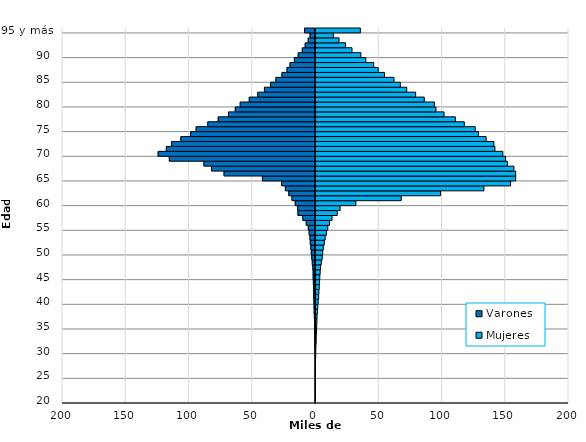
| Category | Varones | Mujeres |
|---|---|---|
| 20 | -145 | 117 |
| 21 | -134 | 126 |
| 22 | -133 | 121 |
| 23 | -152 | 178 |
| 24 | -229 | 221 |
| 25 | -256 | 236 |
| 26 | -257 | 311 |
| 27 | -258 | 339 |
| 28 | -273 | 433 |
| 29 | -349 | 555 |
| 30 | -364 | 589 |
| 31 | -412 | 704 |
| 32 | -460 | 925 |
| 33 | -539 | 994 |
| 34 | -566 | 1176 |
| 35 | -627 | 1331 |
| 36 | -670 | 1495 |
| 37 | -866 | 1628 |
| 38 | -1052 | 1963 |
| 39 | -1124 | 2200 |
| 40 | -1225 | 2527 |
| 41 | -1397 | 2914 |
| 42 | -1448 | 3090 |
| 43 | -1575 | 3341 |
| 44 | -1693 | 3613 |
| 45 | -1873 | 3783 |
| 46 | -1905 | 4083 |
| 47 | -2177 | 4333 |
| 48 | -2553 | 5016 |
| 49 | -2931 | 5681 |
| 50 | -3334 | 6096 |
| 51 | -3624 | 6556 |
| 52 | -4116 | 7354 |
| 53 | -4353 | 8049 |
| 54 | -4987 | 9048 |
| 55 | -5680 | 10104 |
| 56 | -7330 | 11486 |
| 57 | -10013 | 13469 |
| 58 | -13895 | 17571 |
| 59 | -14011 | 19859 |
| 60 | -16030 | 32288 |
| 61 | -18584 | 68182 |
| 62 | -21127 | 99222 |
| 63 | -23815 | 133556 |
| 64 | -26736 | 154618 |
| 65 | -41959 | 158638 |
| 66 | -72287 | 158656 |
| 67 | -82210 | 157232 |
| 68 | -88192 | 152077 |
| 69 | -115565 | 150625 |
| 70 | -124415 | 148487 |
| 71 | -117908 | 142226 |
| 72 | -113771 | 141435 |
| 73 | -106441 | 135263 |
| 74 | -98673 | 129168 |
| 75 | -94394 | 126633 |
| 76 | -85182 | 118027 |
| 77 | -76916 | 110933 |
| 78 | -68823 | 102015 |
| 79 | -63405 | 95639 |
| 80 | -59511 | 94346 |
| 81 | -52363 | 86367 |
| 82 | -45609 | 79556 |
| 83 | -40365 | 72513 |
| 84 | -35466 | 67450 |
| 85 | -31293 | 62449 |
| 86 | -26494 | 54915 |
| 87 | -22522 | 49933 |
| 88 | -20127 | 46410 |
| 89 | -16708 | 40183 |
| 90 | -13656 | 36282 |
| 91 | -10426 | 29261 |
| 92 | -8164 | 24123 |
| 93 | -5761 | 19000 |
| 94 | -4329 | 14489 |
| 95 y más | -8643 | 35872 |